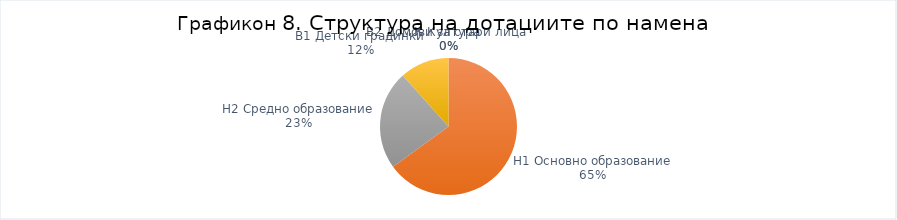
| Category | Структура  |
|---|---|
| К Култура  | 0 |
| H1 Основно образование | 65.025 |
| H2 Средно образование | 23.365 |
| B1 Детски градинки | 11.611 |
| B2 Домови за стари лица  | 0 |